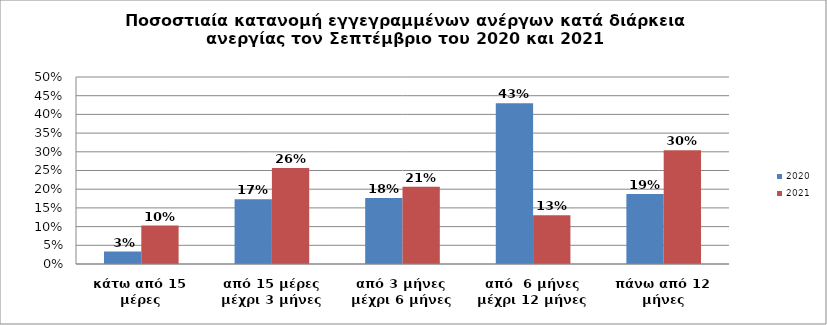
| Category | 2020 | 2021 |
|---|---|---|
| κάτω από 15 μέρες | 0.033 | 0.103 |
| από 15 μέρες μέχρι 3 μήνες | 0.173 | 0.256 |
| από 3 μήνες μέχρι 6 μήνες | 0.176 | 0.206 |
| από  6 μήνες μέχρι 12 μήνες | 0.43 | 0.13 |
| πάνω από 12 μήνες | 0.187 | 0.304 |